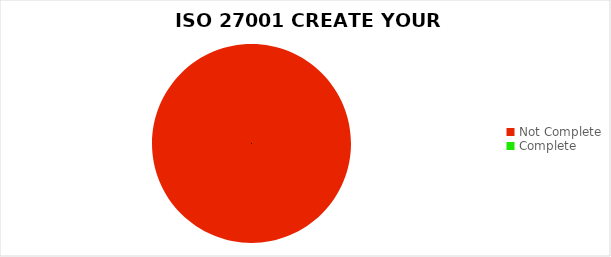
| Category | Series 0 |
|---|---|
| Not Complete | 2 |
| Complete | 0 |